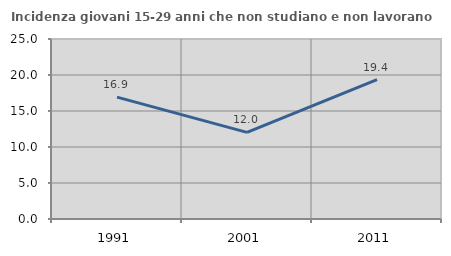
| Category | Incidenza giovani 15-29 anni che non studiano e non lavorano  |
|---|---|
| 1991.0 | 16.929 |
| 2001.0 | 12.026 |
| 2011.0 | 19.367 |